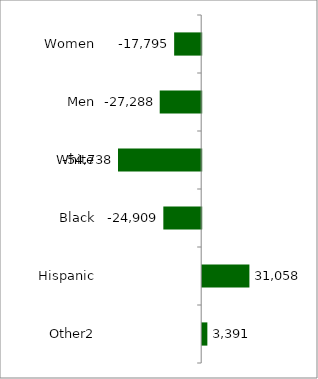
| Category | 50 states and D.C. |
|---|---|
| Women | -17795 |
| Men | -27288 |
| White | -54738 |
| Black | -24909 |
| Hispanic | 31058 |
| Other2 | 3391 |